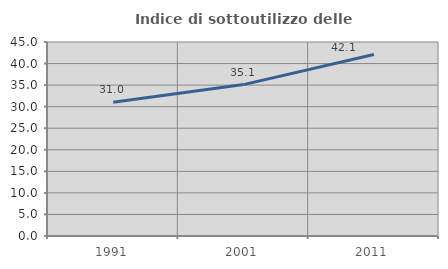
| Category | Indice di sottoutilizzo delle abitazioni  |
|---|---|
| 1991.0 | 31.034 |
| 2001.0 | 35.119 |
| 2011.0 | 42.094 |